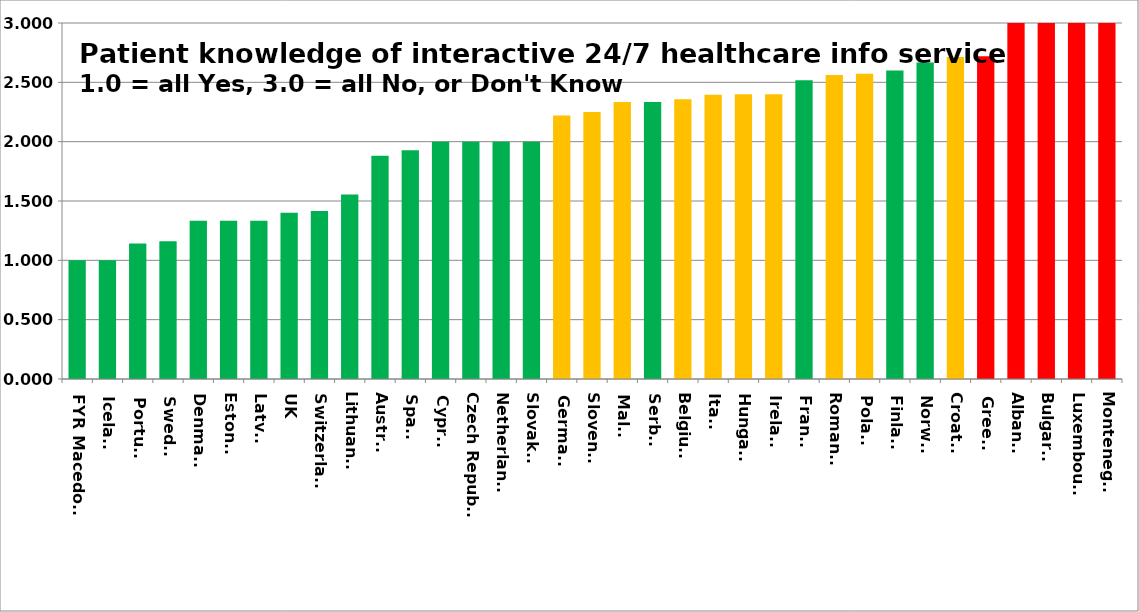
| Category | Series 0 |
|---|---|
| FYR Macedonia | 1 |
| Iceland | 1 |
| Portugal | 1.143 |
| Sweden | 1.16 |
| Denmark | 1.333 |
| Estonia | 1.333 |
| Latvia | 1.333 |
| UK | 1.4 |
| Switzerland | 1.417 |
| Lithuania | 1.556 |
| Austria | 1.882 |
| Spain | 1.929 |
| Cyprus | 2 |
| Czech Republic | 2 |
| Netherlands | 2 |
| Slovakia | 2 |
| Germany | 2.22 |
| Slovenia | 2.25 |
| Malta | 2.333 |
| Serbia | 2.333 |
| Belgium | 2.357 |
| Italy | 2.394 |
| Hungary | 2.4 |
| Ireland | 2.4 |
| France | 2.517 |
| Romania | 2.562 |
| Poland | 2.571 |
| Finland | 2.6 |
| Norway | 2.667 |
| Croatia | 2.714 |
| Greece | 2.72 |
| Albania | 3 |
| Bulgaria | 3 |
| Luxembourg | 3 |
| Montenegro | 3 |